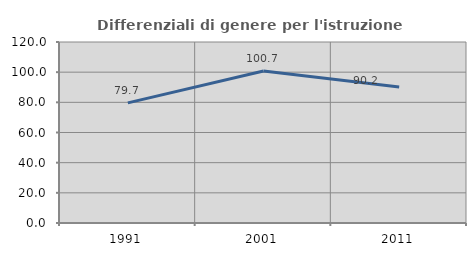
| Category | Differenziali di genere per l'istruzione superiore |
|---|---|
| 1991.0 | 79.665 |
| 2001.0 | 100.734 |
| 2011.0 | 90.155 |